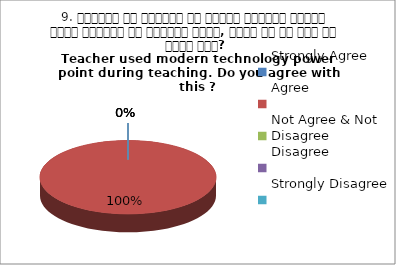
| Category | 9. शिक्षक ने शिक्षण के दौरान आधुनिक तकनीक पावर पॉइन्ट का प्रयोग किया, क्या आप इस बात से सहमत हैं? 
Teacher used modern technology power point during teaching. Do you agree with this ?
 Agree |
|---|---|
| Strongly Agree | 0 |
| Agree | 1 |
| Not Agree & Not Disagree | 0 |
| Disagree | 0 |
| Strongly Disagree | 0 |